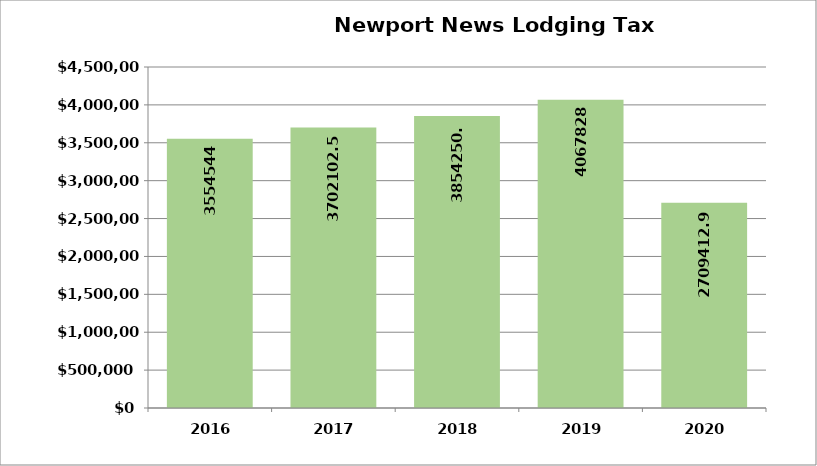
| Category | Series 1 |
|---|---|
| 2016.0 | 3554544 |
| 2017.0 | 3702102.54 |
| 2018.0 | 3854250.7 |
| 2019.0 | 4067828 |
| 2020.0 | 2709412.92 |